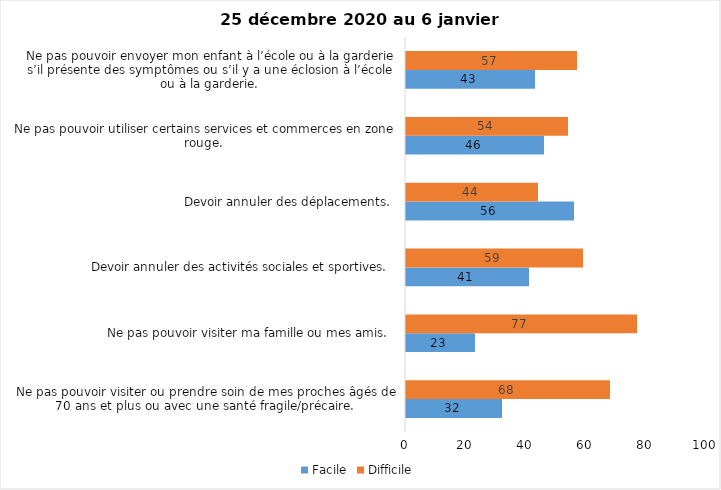
| Category | Facile | Difficile |
|---|---|---|
| Ne pas pouvoir visiter ou prendre soin de mes proches âgés de 70 ans et plus ou avec une santé fragile/précaire.  | 32 | 68 |
| Ne pas pouvoir visiter ma famille ou mes amis.  | 23 | 77 |
| Devoir annuler des activités sociales et sportives.  | 41 | 59 |
| Devoir annuler des déplacements.  | 56 | 44 |
| Ne pas pouvoir utiliser certains services et commerces en zone rouge.  | 46 | 54 |
| Ne pas pouvoir envoyer mon enfant à l’école ou à la garderie s’il présente des symptômes ou s’il y a une éclosion à l’école ou à la garderie.  | 43 | 57 |